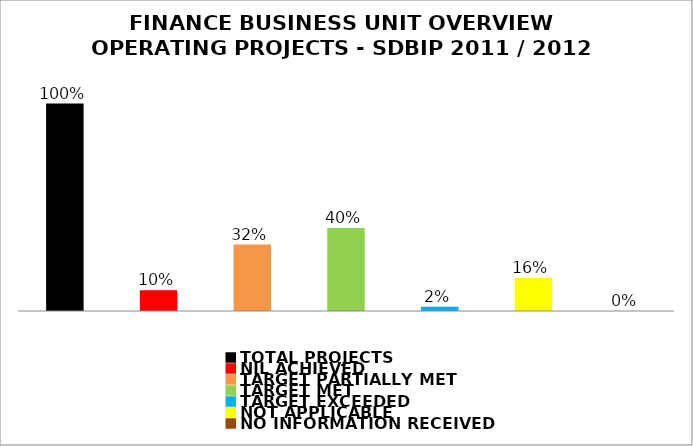
| Category | Series 0 |
|---|---|
| TOTAL PROJECTS | 1 |
| NIL ACHIEVED | 0.1 |
| TARGET PARTIALLY MET | 0.32 |
| TARGET MET | 0.4 |
| TARGET EXCEEDED | 0.02 |
| NOT APPLICABLE | 0.16 |
| NO INFORMATION RECEIVED | 0 |